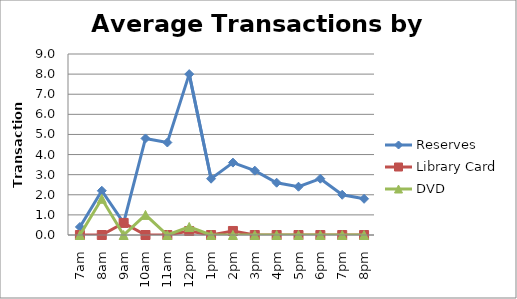
| Category | Reserves | Library Card | DVD |
|---|---|---|---|
| 7am | 0.4 | 0 | 0 |
| 8am | 2.2 | 0 | 1.8 |
| 9am | 0.6 | 0.6 | 0 |
| 10am | 4.8 | 0 | 1 |
| 11am | 4.6 | 0 | 0 |
| 12pm | 8 | 0.2 | 0.4 |
| 1pm | 2.8 | 0 | 0 |
| 2pm | 3.6 | 0.2 | 0 |
| 3pm | 3.2 | 0 | 0 |
| 4pm | 2.6 | 0 | 0 |
| 5pm | 2.4 | 0 | 0 |
| 6pm | 2.8 | 0 | 0 |
| 7pm | 2 | 0 | 0 |
| 8pm | 1.8 | 0 | 0 |